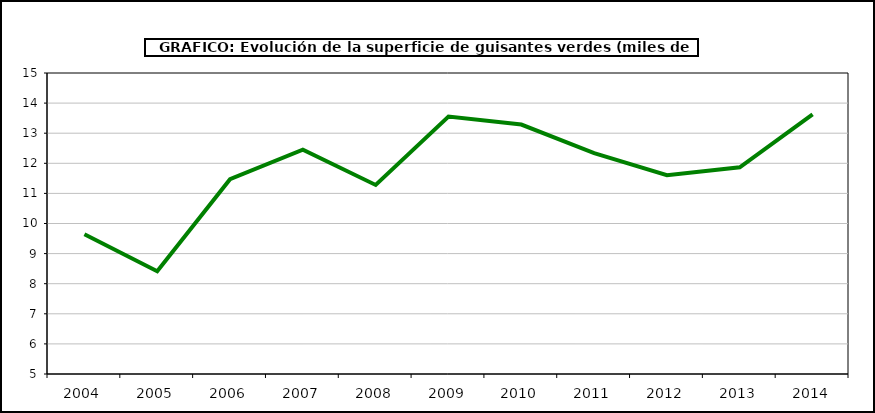
| Category | superficie |
|---|---|
| 2004.0 | 9.64 |
| 2005.0 | 8.415 |
| 2006.0 | 11.47 |
| 2007.0 | 12.451 |
| 2008.0 | 11.28 |
| 2009.0 | 13.552 |
| 2010.0 | 13.288 |
| 2011.0 | 12.338 |
| 2012.0 | 11.604 |
| 2013.0 | 11.867 |
| 2014.0 | 13.624 |